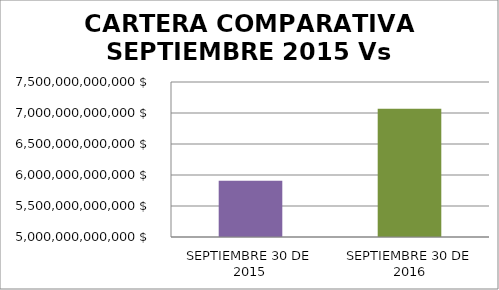
| Category | Series 0 |
|---|---|
| SEPTIEMBRE 30 DE 2015 | 5908435751016 |
| SEPTIEMBRE 30 DE 2016 | 7068378037844 |